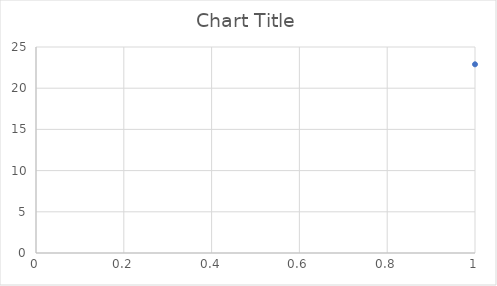
| Category | Series 0 |
|---|---|
| 0 | 22.9 |
| 1 | 22.9 |
| 2 | 22.9 |
| 3 | 22.9 |
| 4 | 22.9 |
| 5 | 22.9 |
| 6 | 22.9 |
| 7 | 22.9 |
| 8 | 22.9 |
| 9 | 22.8 |
| 10 | 22.9 |
| 11 | 22.8 |
| 12 | 22.8 |
| 13 | 22.8 |
| 14 | 22.8 |
| 15 | 22.8 |
| 16 | 22.8 |
| 17 | 22.8 |
| 18 | 22.8 |
| 19 | 22.8 |
| 20 | 22.8 |
| 21 | 22.8 |
| 22 | 22.8 |
| 23 | 22.8 |
| 24 | 22.8 |
| 25 | 22.8 |
| 26 | 22.8 |
| 27 | 22.8 |
| 28 | 22.8 |
| 29 | 22.8 |
| 30 | 22.8 |
| 31 | 22.8 |
| 32 | 22.8 |
| 33 | 22.8 |
| 34 | 22.8 |
| 35 | 22.8 |
| 36 | 22.8 |
| 37 | 22.7 |
| 38 | 22.8 |
| 39 | 22.7 |
| 40 | 22.7 |
| 41 | 22.7 |
| 42 | 22.8 |
| 43 | 22.7 |
| 44 | 22.7 |
| 45 | 22.7 |
| 46 | 22.7 |
| 47 | 22.7 |
| 48 | 22.7 |
| 49 | 22.8 |
| 50 | 22.7 |
| 51 | 22.7 |
| 52 | 22.7 |
| 53 | 22.7 |
| 54 | 22.7 |
| 55 | 22.7 |
| 56 | 22.7 |
| 57 | 22.7 |
| 58 | 22.7 |
| 59 | 22.7 |
| 60 | 22.7 |
| 61 | 22.7 |
| 62 | 22.7 |
| 63 | 22.7 |
| 64 | 22.7 |
| 65 | 22.7 |
| 66 | 22.7 |
| 67 | 22.7 |
| 68 | 22.7 |
| 69 | 22.7 |
| 70 | 22.7 |
| 71 | 22.7 |
| 72 | 22.7 |
| 73 | 22.7 |
| 74 | 22.7 |
| 75 | 22.7 |
| 76 | 22.7 |
| 77 | 22.7 |
| 78 | 22.7 |
| 79 | 22.7 |
| 80 | 22.7 |
| 81 | 22.7 |
| 82 | 22.7 |
| 83 | 22.7 |
| 84 | 22.7 |
| 85 | 22.7 |
| 86 | 22.7 |
| 87 | 22.7 |
| 88 | 22.7 |
| 89 | 22.7 |
| 90 | 22.7 |
| 91 | 22.7 |
| 92 | 22.7 |
| 93 | 22.7 |
| 94 | 22.7 |
| 95 | 22.6 |
| 96 | 22.6 |
| 97 | 22.7 |
| 98 | 22.7 |
| 99 | 22.6 |
| 100 | 22.7 |
| 101 | 22.7 |
| 102 | 22.6 |
| 103 | 22.7 |
| 104 | 22.6 |
| 105 | 22.7 |
| 106 | 22.6 |
| 107 | 21.5 |
| 108 | 17.3 |
| 109 | 17.4 |
| 110 | 17.7 |
| 111 | 17.9 |
| 112 | 18 |
| 113 | 18.1 |
| 114 | 18.2 |
| 115 | 18.3 |
| 116 | 18.3 |
| 117 | 18.6 |
| 118 | 18.7 |
| 119 | 18.7 |
| 120 | 18.7 |
| 121 | 18.4 |
| 122 | 18.4 |
| 123 | 18.7 |
| 124 | 18.4 |
| 125 | 18.5 |
| 126 | 18.7 |
| 127 | 18.7 |
| 128 | 18.4 |
| 129 | 18.6 |
| 130 | 18.7 |
| 131 | 18.5 |
| 132 | 18.5 |
| 133 | 18.8 |
| 134 | 18.7 |
| 135 | 18.5 |
| 136 | 18.7 |
| 137 | 18.8 |
| 138 | 18.6 |
| 139 | 18.8 |
| 140 | 18.8 |
| 141 | 18.9 |
| 142 | 18.7 |
| 143 | 18.9 |
| 144 | 18.7 |
| 145 | 18.9 |
| 146 | 18.9 |
| 147 | 20.5 |
| 148 | 22.6 |
| 149 | 22.6 |
| 150 | 22.6 |
| 151 | 22.6 |
| 152 | 22.6 |
| 153 | 22.5 |
| 154 | 22.5 |
| 155 | 22.5 |
| 156 | 22.5 |
| 157 | 22.5 |
| 158 | 22.5 |
| 159 | 22.4 |
| 160 | 22.4 |
| 161 | 22.3 |
| 162 | 22.3 |
| 163 | 22.3 |
| 164 | 22.2 |
| 165 | 22.2 |
| 166 | 22.1 |
| 167 | 22.1 |
| 168 | 22.1 |
| 169 | 22 |
| 170 | 22 |
| 171 | 21.9 |
| 172 | 21.9 |
| 173 | 21.8 |
| 174 | 21.8 |
| 175 | 21.7 |
| 176 | 21.6 |
| 177 | 21.6 |
| 178 | 21.6 |
| 179 | 21.5 |
| 180 | 21.5 |
| 181 | 21.4 |
| 182 | 21.4 |
| 183 | 21.3 |
| 184 | 21.3 |
| 185 | 21.2 |
| 186 | 21.1 |
| 187 | 21.1 |
| 188 | 21 |
| 189 | 21 |
| 190 | 20.9 |
| 191 | 20.8 |
| 192 | 20.8 |
| 193 | 20.7 |
| 194 | 20.6 |
| 195 | 20.5 |
| 196 | 20.5 |
| 197 | 20.4 |
| 198 | 20.3 |
| 199 | 20.2 |
| 200 | 20.1 |
| 201 | 20 |
| 202 | 19.9 |
| 203 | 19.8 |
| 204 | 19.7 |
| 205 | 19.7 |
| 206 | 19.6 |
| 207 | 19.5 |
| 208 | 19.4 |
| 209 | 19.3 |
| 210 | 19.3 |
| 211 | 19.2 |
| 212 | 19.1 |
| 213 | 19.4 |
| 214 | 19.8 |
| 215 | 19.9 |
| 216 | 20 |
| 217 | 20.4 |
| 218 | 21.2 |
| 219 | 21.8 |
| 220 | 22 |
| 221 | 17.8 |
| 222 | 17.7 |
| 223 | 17.8 |
| 224 | 17.9 |
| 225 | 18 |
| 226 | 18.1 |
| 227 | 18.1 |
| 228 | 21.9 |
| 229 | 20.9 |
| 230 | 18.2 |
| 231 | 18.2 |
| 232 | 18.2 |
| 233 | 18.3 |
| 234 | 18.3 |
| 235 | 18.3 |
| 236 | 18.5 |
| 237 | 18.7 |
| 238 | 18.7 |
| 239 | 18.8 |
| 240 | 18.8 |
| 241 | 18.5 |
| 242 | 18.8 |
| 243 | 19.5 |
| 244 | 22.6 |
| 245 | 22.6 |
| 246 | 22.6 |
| 247 | 22.5 |
| 248 | 22.5 |
| 249 | 22.5 |
| 250 | 22.5 |
| 251 | 22.5 |
| 252 | 22.4 |
| 253 | 22.4 |
| 254 | 22.4 |
| 255 | 22.4 |
| 256 | 22.3 |
| 257 | 22.3 |
| 258 | 22.2 |
| 259 | 22.2 |
| 260 | 22.2 |
| 261 | 22.1 |
| 262 | 22.1 |
| 263 | 22.1 |
| 264 | 22 |
| 265 | 22 |
| 266 | 21.9 |
| 267 | 21.9 |
| 268 | 21.8 |
| 269 | 21.8 |
| 270 | 21.7 |
| 271 | 21.7 |
| 272 | 21.6 |
| 273 | 21.6 |
| 274 | 21.5 |
| 275 | 21.5 |
| 276 | 21.4 |
| 277 | 21.3 |
| 278 | 21.3 |
| 279 | 21.2 |
| 280 | 21.2 |
| 281 | 21.1 |
| 282 | 21.1 |
| 283 | 21 |
| 284 | 20.9 |
| 285 | 20.9 |
| 286 | 20.8 |
| 287 | 20.7 |
| 288 | 20.7 |
| 289 | 20.6 |
| 290 | 20.6 |
| 291 | 20.5 |
| 292 | 20.5 |
| 293 | 20.4 |
| 294 | 20.3 |
| 295 | 20.3 |
| 296 | 20.2 |
| 297 | 20.2 |
| 298 | 20.1 |
| 299 | 20.1 |
| 300 | 20 |
| 301 | 19.9 |
| 302 | 19.9 |
| 303 | 19.8 |
| 304 | 19.8 |
| 305 | 19.7 |
| 306 | 19.7 |
| 307 | 19.6 |
| 308 | 19.6 |
| 309 | 19.5 |
| 310 | 19.5 |
| 311 | 19.4 |
| 312 | 19.3 |
| 313 | 19.2 |
| 314 | 19.2 |
| 315 | 19.3 |
| 316 | 19.2 |
| 317 | 19.1 |
| 318 | 17.6 |
| 319 | 17.7 |
| 320 | 17.9 |
| 321 | 18 |
| 322 | 18.1 |
| 323 | 18.1 |
| 324 | 18.2 |
| 325 | 18.2 |
| 326 | 18.3 |
| 327 | 18.3 |
| 328 | 18.3 |
| 329 | 18.5 |
| 330 | 18.4 |
| 331 | 18.6 |
| 332 | 18.6 |
| 333 | 18.5 |
| 334 | 18.5 |
| 335 | 18.7 |
| 336 | 18.4 |
| 337 | 18.7 |
| 338 | 18.6 |
| 339 | 19.7 |
| 340 | 22.6 |
| 341 | 22.6 |
| 342 | 22.5 |
| 343 | 22.5 |
| 344 | 22.5 |
| 345 | 22.4 |
| 346 | 22.4 |
| 347 | 22.3 |
| 348 | 22.3 |
| 349 | 22.3 |
| 350 | 22.2 |
| 351 | 22.2 |
| 352 | 22.1 |
| 353 | 22.1 |
| 354 | 22 |
| 355 | 22 |
| 356 | 21.9 |
| 357 | 21.9 |
| 358 | 21.8 |
| 359 | 21.8 |
| 360 | 21.7 |
| 361 | 21.6 |
| 362 | 21.6 |
| 363 | 21.5 |
| 364 | 21.5 |
| 365 | 21.4 |
| 366 | 21.4 |
| 367 | 21.3 |
| 368 | 21.2 |
| 369 | 21.2 |
| 370 | 21.1 |
| 371 | 21.1 |
| 372 | 21 |
| 373 | 20.9 |
| 374 | 20.9 |
| 375 | 20.8 |
| 376 | 20.7 |
| 377 | 20.7 |
| 378 | 20.6 |
| 379 | 20.5 |
| 380 | 20.5 |
| 381 | 20.4 |
| 382 | 20.3 |
| 383 | 20.3 |
| 384 | 20.2 |
| 385 | 20.2 |
| 386 | 20.1 |
| 387 | 20.1 |
| 388 | 20 |
| 389 | 19.9 |
| 390 | 19.9 |
| 391 | 19.8 |
| 392 | 19.7 |
| 393 | 19.7 |
| 394 | 19.6 |
| 395 | 19.6 |
| 396 | 19.5 |
| 397 | 19.4 |
| 398 | 19.4 |
| 399 | 19.3 |
| 400 | 19.2 |
| 401 | 19.2 |
| 402 | 19.1 |
| 403 | 19.1 |
| 404 | 19 |
| 405 | 18.9 |
| 406 | 18.9 |
| 407 | 18.8 |
| 408 | 18.8 |
| 409 | 18.7 |
| 410 | 18.6 |
| 411 | 18.5 |
| 412 | 19.2 |
| 413 | 22.9 |
| 414 | 0 |
| 415 | 0 |
| 416 | 0 |
| 417 | 0 |
| 418 | 0 |
| 419 | 0 |
| 420 | 0 |
| 421 | 0 |
| 422 | 0 |
| 423 | 0 |
| 424 | 0 |
| 425 | 0 |
| 426 | 0 |
| 427 | 0 |
| 428 | 0 |
| 429 | 0 |
| 430 | 0 |
| 431 | 0 |
| 432 | 0 |
| 433 | 0 |
| 434 | 0 |
| 435 | 0 |
| 436 | 0 |
| 437 | 0 |
| 438 | 0 |
| 439 | 0 |
| 440 | 0 |
| 441 | 0 |
| 442 | 0 |
| 443 | 0 |
| 444 | 0 |
| 445 | 0 |
| 446 | 0 |
| 447 | 0 |
| 448 | 0 |
| 449 | 0 |
| 450 | 0 |
| 451 | 0 |
| 452 | 0 |
| 453 | 0 |
| 454 | 0 |
| 455 | 0 |
| 456 | 0 |
| 457 | 0 |
| 458 | 0 |
| 459 | 0 |
| 460 | 0 |
| 461 | 0 |
| 462 | 0 |
| 463 | 0 |
| 464 | 0 |
| 465 | 0 |
| 466 | 0 |
| 467 | 0 |
| 468 | 0 |
| 469 | 0 |
| 470 | 0 |
| 471 | 0 |
| 472 | 0 |
| 473 | 0 |
| 474 | 0 |
| 475 | 0 |
| 476 | 0 |
| 477 | 0 |
| 478 | 0 |
| 479 | 0 |
| 480 | 0 |
| 481 | 0 |
| 482 | 0 |
| 483 | 0 |
| 484 | 0 |
| 485 | 0 |
| 486 | 0 |
| 487 | 0 |
| 488 | 0 |
| 489 | 0 |
| 490 | 0 |
| 491 | 0 |
| 492 | 0 |
| 493 | 0 |
| 494 | 0 |
| 495 | 0 |
| 496 | 0 |
| 497 | 0 |
| 498 | 0 |
| 499 | 0 |
| 500 | 0 |
| 501 | 0 |
| 502 | 0 |
| 503 | 0 |
| 504 | 0 |
| 505 | 0 |
| 506 | 0 |
| 507 | 0 |
| 508 | 0 |
| 509 | 0 |
| 510 | 0 |
| 511 | 0 |
| 512 | 0 |
| 513 | 0 |
| 514 | 0 |
| 515 | 0 |
| 516 | 0 |
| 517 | 0 |
| 518 | 0 |
| 519 | 0 |
| 520 | 0 |
| 521 | 0 |
| 522 | 0 |
| 523 | 0 |
| 524 | 0 |
| 525 | 0 |
| 526 | 0 |
| 527 | 0 |
| 528 | 0 |
| 529 | 0 |
| 530 | 0 |
| 531 | 0 |
| 532 | 0 |
| 533 | 0 |
| 534 | 0 |
| 535 | 0 |
| 536 | 0 |
| 537 | 0 |
| 538 | 0 |
| 539 | 0 |
| 540 | 0 |
| 541 | 0 |
| 542 | 0 |
| 543 | 0 |
| 544 | 0 |
| 545 | 0 |
| 546 | 0 |
| 547 | 0 |
| 548 | 0 |
| 549 | 0 |
| 550 | 0 |
| 551 | 0 |
| 552 | 0 |
| 553 | 0 |
| 554 | 0 |
| 555 | 0 |
| 556 | 0 |
| 557 | 0 |
| 558 | 0 |
| 559 | 0 |
| 560 | 0 |
| 561 | 0 |
| 562 | 0 |
| 563 | 0 |
| 564 | 0 |
| 565 | 0 |
| 566 | 0 |
| 567 | 0 |
| 568 | 0 |
| 569 | 0 |
| 570 | 0 |
| 571 | 0 |
| 572 | 0 |
| 573 | 0 |
| 574 | 0 |
| 575 | 0 |
| 576 | 0 |
| 577 | 0 |
| 578 | 0 |
| 579 | 0 |
| 580 | 0 |
| 581 | 0 |
| 582 | 0 |
| 583 | 0 |
| 584 | 0 |
| 585 | 0 |
| 586 | 0 |
| 587 | 0 |
| 588 | 0 |
| 589 | 0 |
| 590 | 0 |
| 591 | 0 |
| 592 | 0 |
| 593 | 0 |
| 594 | 0 |
| 595 | 0 |
| 596 | 0 |
| 597 | 0 |
| 598 | 0 |
| 599 | 0 |
| 600 | 0 |
| 601 | 0 |
| 602 | 0 |
| 603 | 0 |
| 604 | 0 |
| 605 | 0 |
| 606 | 0 |
| 607 | 0 |
| 608 | 0 |
| 609 | 0 |
| 610 | 0 |
| 611 | 0 |
| 612 | 0 |
| 613 | 0 |
| 614 | 0 |
| 615 | 0 |
| 616 | 0 |
| 617 | 0 |
| 618 | 0 |
| 619 | 0 |
| 620 | 0 |
| 621 | 0 |
| 622 | 0 |
| 623 | 0 |
| 624 | 0 |
| 625 | 0 |
| 626 | 0 |
| 627 | 0 |
| 628 | 0 |
| 629 | 0 |
| 630 | 0 |
| 631 | 0 |
| 632 | 0 |
| 633 | 0 |
| 634 | 0 |
| 635 | 0 |
| 636 | 0 |
| 637 | 0 |
| 638 | 0 |
| 639 | 0 |
| 640 | 0 |
| 641 | 0 |
| 642 | 0 |
| 643 | 0 |
| 644 | 0 |
| 645 | 0 |
| 646 | 0 |
| 647 | 0 |
| 648 | 0 |
| 649 | 0 |
| 650 | 0 |
| 651 | 0 |
| 652 | 0 |
| 653 | 0 |
| 654 | 0 |
| 655 | 0 |
| 656 | 0 |
| 657 | 0 |
| 658 | 0 |
| 659 | 0 |
| 660 | 0 |
| 661 | 0 |
| 662 | 0 |
| 663 | 0 |
| 664 | 0 |
| 665 | 0 |
| 666 | 0 |
| 667 | 0 |
| 668 | 0 |
| 669 | 0 |
| 670 | 0 |
| 671 | 0 |
| 672 | 0 |
| 673 | 0 |
| 674 | 0 |
| 675 | 0 |
| 676 | 0 |
| 677 | 0 |
| 678 | 0 |
| 679 | 0 |
| 680 | 0 |
| 681 | 0 |
| 682 | 0 |
| 683 | 0 |
| 684 | 0 |
| 685 | 0 |
| 686 | 0 |
| 687 | 0 |
| 688 | 0 |
| 689 | 0 |
| 690 | 0 |
| 691 | 0 |
| 692 | 0 |
| 693 | 0 |
| 694 | 0 |
| 695 | 0 |
| 696 | 0 |
| 697 | 0 |
| 698 | 0 |
| 699 | 0 |
| 700 | 0 |
| 701 | 0 |
| 702 | 0 |
| 703 | 0 |
| 704 | 0 |
| 705 | 0 |
| 706 | 0 |
| 707 | 0 |
| 708 | 0 |
| 709 | 0 |
| 710 | 0 |
| 711 | 0 |
| 712 | 0 |
| 713 | 0 |
| 714 | 0 |
| 715 | 0 |
| 716 | 0 |
| 717 | 0 |
| 718 | 0 |
| 719 | 0 |
| 720 | 0 |
| 721 | 0 |
| 722 | 0 |
| 723 | 0 |
| 724 | 0 |
| 725 | 0 |
| 726 | 0 |
| 727 | 0 |
| 728 | 0 |
| 729 | 0 |
| 730 | 0 |
| 731 | 0 |
| 732 | 0 |
| 733 | 0 |
| 734 | 0 |
| 735 | 0 |
| 736 | 0 |
| 737 | 0 |
| 738 | 0 |
| 739 | 0 |
| 740 | 0 |
| 741 | 0 |
| 742 | 0 |
| 743 | 0 |
| 744 | 0 |
| 745 | 0 |
| 746 | 0 |
| 747 | 0 |
| 748 | 0 |
| 749 | 0 |
| 750 | 0 |
| 751 | 0 |
| 752 | 0 |
| 753 | 0 |
| 754 | 0 |
| 755 | 0 |
| 756 | 0 |
| 757 | 0 |
| 758 | 0 |
| 759 | 0 |
| 760 | 0 |
| 761 | 0 |
| 762 | 0 |
| 763 | 0 |
| 764 | 0 |
| 765 | 0 |
| 766 | 0 |
| 767 | 0 |
| 768 | 0 |
| 769 | 0 |
| 770 | 0 |
| 771 | 0 |
| 772 | 0 |
| 773 | 0 |
| 774 | 0 |
| 775 | 0 |
| 776 | 0 |
| 777 | 0 |
| 778 | 0 |
| 779 | 0 |
| 780 | 0 |
| 781 | 0 |
| 782 | 0 |
| 783 | 0 |
| 784 | 0 |
| 785 | 0 |
| 786 | 0 |
| 787 | 0 |
| 788 | 0 |
| 789 | 0 |
| 790 | 0 |
| 791 | 0 |
| 792 | 0 |
| 793 | 0 |
| 794 | 0 |
| 795 | 0 |
| 796 | 0 |
| 797 | 0 |
| 798 | 0 |
| 799 | 0 |
| 800 | 0 |
| 801 | 0 |
| 802 | 0 |
| 803 | 0 |
| 804 | 0 |
| 805 | 0 |
| 806 | 0 |
| 807 | 0 |
| 808 | 0 |
| 809 | 0 |
| 810 | 0 |
| 811 | 0 |
| 812 | 0 |
| 813 | 0 |
| 814 | 0 |
| 815 | 0 |
| 816 | 0 |
| 817 | 0 |
| 818 | 0 |
| 819 | 0 |
| 820 | 0 |
| 821 | 0 |
| 822 | 0 |
| 823 | 0 |
| 824 | 0 |
| 825 | 0 |
| 826 | 0 |
| 827 | 0 |
| 828 | 0 |
| 829 | 0 |
| 830 | 0 |
| 831 | 0 |
| 832 | 0 |
| 833 | 0 |
| 834 | 0 |
| 835 | 0 |
| 836 | 0 |
| 837 | 0 |
| 838 | 0 |
| 839 | 0 |
| 840 | 0 |
| 841 | 0 |
| 842 | 0 |
| 843 | 0 |
| 844 | 0 |
| 845 | 0 |
| 846 | 0 |
| 847 | 0 |
| 848 | 0 |
| 849 | 0 |
| 850 | 0 |
| 851 | 0 |
| 852 | 0 |
| 853 | 0 |
| 854 | 0 |
| 855 | 0 |
| 856 | 0 |
| 857 | 0 |
| 858 | 0 |
| 859 | 0 |
| 860 | 0 |
| 861 | 0 |
| 862 | 0 |
| 863 | 0 |
| 864 | 0 |
| 865 | 0 |
| 866 | 0 |
| 867 | 0 |
| 868 | 0 |
| 869 | 0 |
| 870 | 0 |
| 871 | 0 |
| 872 | 0 |
| 873 | 0 |
| 874 | 0 |
| 875 | 0 |
| 876 | 0 |
| 877 | 0 |
| 878 | 0 |
| 879 | 0 |
| 880 | 0 |
| 881 | 0 |
| 882 | 0 |
| 883 | 0 |
| 884 | 0 |
| 885 | 0 |
| 886 | 0 |
| 887 | 0 |
| 888 | 0 |
| 889 | 0 |
| 890 | 0 |
| 891 | 0 |
| 892 | 0 |
| 893 | 0 |
| 894 | 0 |
| 895 | 0 |
| 896 | 0 |
| 897 | 0 |
| 898 | 0 |
| 899 | 0 |
| 900 | 0 |
| 901 | 0 |
| 902 | 0 |
| 903 | 0 |
| 904 | 0 |
| 905 | 0 |
| 906 | 0 |
| 907 | 0 |
| 908 | 0 |
| 909 | 0 |
| 910 | 0 |
| 911 | 0 |
| 912 | 0 |
| 913 | 0 |
| 914 | 0 |
| 915 | 0 |
| 916 | 0 |
| 917 | 0 |
| 918 | 0 |
| 919 | 0 |
| 920 | 0 |
| 921 | 0 |
| 922 | 0 |
| 923 | 0 |
| 924 | 0 |
| 925 | 0 |
| 926 | 0 |
| 927 | 0 |
| 928 | 0 |
| 929 | 0 |
| 930 | 0 |
| 931 | 0 |
| 932 | 0 |
| 933 | 0 |
| 934 | 0 |
| 935 | 0 |
| 936 | 0 |
| 937 | 0 |
| 938 | 0 |
| 939 | 0 |
| 940 | 0 |
| 941 | 0 |
| 942 | 0 |
| 943 | 0 |
| 944 | 0 |
| 945 | 0 |
| 946 | 0 |
| 947 | 0 |
| 948 | 0 |
| 949 | 0 |
| 950 | 0 |
| 951 | 0 |
| 952 | 0 |
| 953 | 0 |
| 954 | 0 |
| 955 | 0 |
| 956 | 0 |
| 957 | 0 |
| 958 | 0 |
| 959 | 0 |
| 960 | 0 |
| 961 | 0 |
| 962 | 0 |
| 963 | 0 |
| 964 | 0 |
| 965 | 0 |
| 966 | 0 |
| 967 | 0 |
| 968 | 0 |
| 969 | 0 |
| 970 | 0 |
| 971 | 0 |
| 972 | 0 |
| 973 | 0 |
| 974 | 0 |
| 975 | 0 |
| 976 | 0 |
| 977 | 0 |
| 978 | 0 |
| 979 | 0 |
| 980 | 0 |
| 981 | 0 |
| 982 | 0 |
| 983 | 0 |
| 984 | 0 |
| 985 | 0 |
| 986 | 0 |
| 987 | 0 |
| 988 | 0 |
| 989 | 0 |
| 990 | 0 |
| 991 | 0 |
| 992 | 0 |
| 993 | 0 |
| 994 | 0 |
| 995 | 0 |
| 996 | 0 |
| 997 | 0 |
| 998 | 0 |
| 999 | 0 |
| 1000 | 0 |
| 1001 | 0 |
| 1002 | 0 |
| 1003 | 0 |
| 1004 | 0 |
| 1005 | 0 |
| 1006 | 0 |
| 1007 | 0 |
| 1008 | 0 |
| 1009 | 0 |
| 1010 | 0 |
| 1011 | 0 |
| 1012 | 0 |
| 1013 | 0 |
| 1014 | 0 |
| 1015 | 0 |
| 1016 | 0 |
| 1017 | 0 |
| 1018 | 0 |
| 1019 | 0 |
| 1020 | 0 |
| 1021 | 0 |
| 1022 | 0 |
| 1023 | 0 |
| 1024 | 0 |
| 1025 | 0 |
| 1026 | 0 |
| 1027 | 0 |
| 1028 | 0 |
| 1029 | 0 |
| 1030 | 0 |
| 1031 | 0 |
| 1032 | 0 |
| 1033 | 0 |
| 1034 | 0 |
| 1035 | 0 |
| 1036 | 0 |
| 1037 | 0 |
| 1038 | 0 |
| 1039 | 0 |
| 1040 | 0 |
| 1041 | 0 |
| 1042 | 0 |
| 1043 | 0 |
| 1044 | 0 |
| 1045 | 0 |
| 1046 | 0 |
| 1047 | 0 |
| 1048 | 0 |
| 1049 | 0 |
| 1050 | 0 |
| 1051 | 0 |
| 1052 | 0 |
| 1053 | 0 |
| 1054 | 0 |
| 1055 | 0 |
| 1056 | 0 |
| 1057 | 0 |
| 1058 | 0 |
| 1059 | 0 |
| 1060 | 0 |
| 1061 | 0 |
| 1062 | 0 |
| 1063 | 0 |
| 1064 | 0 |
| 1065 | 0 |
| 1066 | 0 |
| 1067 | 0 |
| 1068 | 0 |
| 1069 | 0 |
| 1070 | 0 |
| 1071 | 0 |
| 1072 | 0 |
| 1073 | 0 |
| 1074 | 0 |
| 1075 | 0 |
| 1076 | 0 |
| 1077 | 0 |
| 1078 | 0 |
| 1079 | 0 |
| 1080 | 0 |
| 1081 | 0 |
| 1082 | 0 |
| 1083 | 0 |
| 1084 | 0 |
| 1085 | 0 |
| 1086 | 0 |
| 1087 | 0 |
| 1088 | 0 |
| 1089 | 0 |
| 1090 | 0 |
| 1091 | 0 |
| 1092 | 0 |
| 1093 | 0 |
| 1094 | 0 |
| 1095 | 0 |
| 1096 | 0 |
| 1097 | 0 |
| 1098 | 0 |
| 1099 | 0 |
| 1100 | 0 |
| 1101 | 0 |
| 1102 | 0 |
| 1103 | 0 |
| 1104 | 0 |
| 1105 | 0 |
| 1106 | 0 |
| 1107 | 0 |
| 1108 | 0 |
| 1109 | 0 |
| 1110 | 0 |
| 1111 | 0 |
| 1112 | 0 |
| 1113 | 0 |
| 1114 | 0 |
| 1115 | 0 |
| 1116 | 0 |
| 1117 | 0 |
| 1118 | 0 |
| 1119 | 0 |
| 1120 | 0 |
| 1121 | 0 |
| 1122 | 0 |
| 1123 | 0 |
| 1124 | 0 |
| 1125 | 0 |
| 1126 | 0 |
| 1127 | 0 |
| 1128 | 0 |
| 1129 | 0 |
| 1130 | 0 |
| 1131 | 0 |
| 1132 | 0 |
| 1133 | 0 |
| 1134 | 0 |
| 1135 | 0 |
| 1136 | 0 |
| 1137 | 0 |
| 1138 | 0 |
| 1139 | 0 |
| 1140 | 0 |
| 1141 | 0 |
| 1142 | 0 |
| 1143 | 0 |
| 1144 | 0 |
| 1145 | 0 |
| 1146 | 0 |
| 1147 | 0 |
| 1148 | 0 |
| 1149 | 0 |
| 1150 | 0 |
| 1151 | 0 |
| 1152 | 0 |
| 1153 | 0 |
| 1154 | 0 |
| 1155 | 0 |
| 1156 | 0 |
| 1157 | 0 |
| 1158 | 0 |
| 1159 | 0 |
| 1160 | 0 |
| 1161 | 0 |
| 1162 | 0 |
| 1163 | 0 |
| 1164 | 0 |
| 1165 | 0 |
| 1166 | 0 |
| 1167 | 0 |
| 1168 | 0 |
| 1169 | 0 |
| 1170 | 0 |
| 1171 | 0 |
| 1172 | 0 |
| 1173 | 0 |
| 1174 | 0 |
| 1175 | 0 |
| 1176 | 0 |
| 1177 | 0 |
| 1178 | 0 |
| 1179 | 0 |
| 1180 | 0 |
| 1181 | 0 |
| 1182 | 0 |
| 1183 | 0 |
| 1184 | 0 |
| 1185 | 0 |
| 1186 | 0 |
| 1187 | 0 |
| 1188 | 0 |
| 1189 | 0 |
| 1190 | 0 |
| 1191 | 0 |
| 1192 | 0 |
| 1193 | 0 |
| 1194 | 0 |
| 1195 | 0 |
| 1196 | 0 |
| 1197 | 0 |
| 1198 | 0 |
| 1199 | 0 |
| 1200 | 0 |
| 1201 | 0 |
| 1202 | 0 |
| 1203 | 0 |
| 1204 | 0 |
| 1205 | 0 |
| 1206 | 0 |
| 1207 | 0 |
| 1208 | 0 |
| 1209 | 0 |
| 1210 | 0 |
| 1211 | 0 |
| 1212 | 0 |
| 1213 | 0 |
| 1214 | 0 |
| 1215 | 0 |
| 1216 | 0 |
| 1217 | 0 |
| 1218 | 0 |
| 1219 | 0 |
| 1220 | 0 |
| 1221 | 0 |
| 1222 | 0 |
| 1223 | 0 |
| 1224 | 0 |
| 1225 | 0 |
| 1226 | 0 |
| 1227 | 0 |
| 1228 | 0 |
| 1229 | 0 |
| 1230 | 0 |
| 1231 | 0 |
| 1232 | 0 |
| 1233 | 0 |
| 1234 | 0 |
| 1235 | 0 |
| 1236 | 0 |
| 1237 | 0 |
| 1238 | 0 |
| 1239 | 0 |
| 1240 | 0 |
| 1241 | 0 |
| 1242 | 0 |
| 1243 | 0 |
| 1244 | 0 |
| 1245 | 0 |
| 1246 | 0 |
| 1247 | 0 |
| 1248 | 0 |
| 1249 | 0 |
| 1250 | 0 |
| 1251 | 0 |
| 1252 | 0 |
| 1253 | 0 |
| 1254 | 0 |
| 1255 | 0 |
| 1256 | 0 |
| 1257 | 0 |
| 1258 | 0 |
| 1259 | 0 |
| 1260 | 0 |
| 1261 | 0 |
| 1262 | 0 |
| 1263 | 0 |
| 1264 | 0 |
| 1265 | 0 |
| 1266 | 0 |
| 1267 | 0 |
| 1268 | 0 |
| 1269 | 0 |
| 1270 | 0 |
| 1271 | 0 |
| 1272 | 0 |
| 1273 | 0 |
| 1274 | 0 |
| 1275 | 0 |
| 1276 | 0 |
| 1277 | 0 |
| 1278 | 0 |
| 1279 | 0 |
| 1280 | 0 |
| 1281 | 0 |
| 1282 | 0 |
| 1283 | 0 |
| 1284 | 0 |
| 1285 | 0 |
| 1286 | 0 |
| 1287 | 0 |
| 1288 | 0 |
| 1289 | 0 |
| 1290 | 0 |
| 1291 | 0 |
| 1292 | 0 |
| 1293 | 0 |
| 1294 | 0 |
| 1295 | 0 |
| 1296 | 0 |
| 1297 | 0 |
| 1298 | 0 |
| 1299 | 0 |
| 1300 | 0 |
| 1301 | 0 |
| 1302 | 0 |
| 1303 | 0 |
| 1304 | 0 |
| 1305 | 0 |
| 1306 | 0 |
| 1307 | 0 |
| 1308 | 0 |
| 1309 | 0 |
| 1310 | 0 |
| 1311 | 0 |
| 1312 | 0 |
| 1313 | 0 |
| 1314 | 0 |
| 1315 | 0 |
| 1316 | 0 |
| 1317 | 0 |
| 1318 | 0 |
| 1319 | 0 |
| 1320 | 0 |
| 1321 | 0 |
| 1322 | 0 |
| 1323 | 0 |
| 1324 | 0 |
| 1325 | 0 |
| 1326 | 0 |
| 1327 | 0 |
| 1328 | 0 |
| 1329 | 0 |
| 1330 | 0 |
| 1331 | 0 |
| 1332 | 0 |
| 1333 | 0 |
| 1334 | 0 |
| 1335 | 0 |
| 1336 | 0 |
| 1337 | 0 |
| 1338 | 0 |
| 1339 | 0 |
| 1340 | 0 |
| 1341 | 0 |
| 1342 | 0 |
| 1343 | 0 |
| 1344 | 0 |
| 1345 | 0 |
| 1346 | 0 |
| 1347 | 0 |
| 1348 | 0 |
| 1349 | 0 |
| 1350 | 0 |
| 1351 | 0 |
| 1352 | 0 |
| 1353 | 0 |
| 1354 | 0 |
| 1355 | 0 |
| 1356 | 0 |
| 1357 | 0 |
| 1358 | 0 |
| 1359 | 0 |
| 1360 | 0 |
| 1361 | 0 |
| 1362 | 0 |
| 1363 | 0 |
| 1364 | 0 |
| 1365 | 0 |
| 1366 | 0 |
| 1367 | 0 |
| 1368 | 0 |
| 1369 | 0 |
| 1370 | 0 |
| 1371 | 0 |
| 1372 | 0 |
| 1373 | 0 |
| 1374 | 0 |
| 1375 | 0 |
| 1376 | 0 |
| 1377 | 0 |
| 1378 | 0 |
| 1379 | 0 |
| 1380 | 0 |
| 1381 | 0 |
| 1382 | 0 |
| 1383 | 0 |
| 1384 | 0 |
| 1385 | 0 |
| 1386 | 0 |
| 1387 | 0 |
| 1388 | 0 |
| 1389 | 0 |
| 1390 | 0 |
| 1391 | 0 |
| 1392 | 0 |
| 1393 | 0 |
| 1394 | 0 |
| 1395 | 0 |
| 1396 | 0 |
| 1397 | 0 |
| 1398 | 0 |
| 1399 | 0 |
| 1400 | 0 |
| 1401 | 0 |
| 1402 | 0 |
| 1403 | 0 |
| 1404 | 0 |
| 1405 | 0 |
| 1406 | 0 |
| 1407 | 0 |
| 1408 | 0 |
| 1409 | 0 |
| 1410 | 0 |
| 1411 | 0 |
| 1412 | 0 |
| 1413 | 0 |
| 1414 | 0 |
| 1415 | 0 |
| 1416 | 0 |
| 1417 | 0 |
| 1418 | 0 |
| 1419 | 0 |
| 1420 | 0 |
| 1421 | 0 |
| 1422 | 0 |
| 1423 | 0 |
| 1424 | 0 |
| 1425 | 0 |
| 1426 | 0 |
| 1427 | 0 |
| 1428 | 0 |
| 1429 | 0 |
| 1430 | 0 |
| 1431 | 0 |
| 1432 | 0 |
| 1433 | 0 |
| 1434 | 0 |
| 1435 | 0 |
| 1436 | 0 |
| 1437 | 0 |
| 1438 | 0 |
| 1439 | 0 |
| 1440 | 0 |
| 1441 | 0 |
| 1442 | 0 |
| 1443 | 0 |
| 1444 | 0 |
| 1445 | 0 |
| 1446 | 0 |
| 1447 | 0 |
| 1448 | 0 |
| 1449 | 0 |
| 1450 | 0 |
| 1451 | 0 |
| 1452 | 0 |
| 1453 | 0 |
| 1454 | 0 |
| 1455 | 0 |
| 1456 | 0 |
| 1457 | 0 |
| 1458 | 0 |
| 1459 | 0 |
| 1460 | 0 |
| 1461 | 0 |
| 1462 | 0 |
| 1463 | 0 |
| 1464 | 0 |
| 1465 | 0 |
| 1466 | 0 |
| 1467 | 0 |
| 1468 | 0 |
| 1469 | 0 |
| 1470 | 0 |
| 1471 | 0 |
| 1472 | 0 |
| 1473 | 0 |
| 1474 | 0 |
| 1475 | 0 |
| 1476 | 0 |
| 1477 | 0 |
| 1478 | 0 |
| 1479 | 0 |
| 1480 | 0 |
| 1481 | 0 |
| 1482 | 0 |
| 1483 | 0 |
| 1484 | 0 |
| 1485 | 0 |
| 1486 | 0 |
| 1487 | 0 |
| 1488 | 0 |
| 1489 | 0 |
| 1490 | 0 |
| 1491 | 0 |
| 1492 | 0 |
| 1493 | 0 |
| 1494 | 0 |
| 1495 | 0 |
| 1496 | 0 |
| 1497 | 0 |
| 1498 | 0 |
| 1499 | 0 |
| 1500 | 0 |
| 1501 | 0 |
| 1502 | 0 |
| 1503 | 0 |
| 1504 | 0 |
| 1505 | 0 |
| 1506 | 0 |
| 1507 | 0 |
| 1508 | 0 |
| 1509 | 0 |
| 1510 | 0 |
| 1511 | 0 |
| 1512 | 0 |
| 1513 | 0 |
| 1514 | 0 |
| 1515 | 0 |
| 1516 | 0 |
| 1517 | 0 |
| 1518 | 0 |
| 1519 | 0 |
| 1520 | 0 |
| 1521 | 0 |
| 1522 | 0 |
| 1523 | 0 |
| 1524 | 0 |
| 1525 | 0 |
| 1526 | 0 |
| 1527 | 0 |
| 1528 | 0 |
| 1529 | 0 |
| 1530 | 0 |
| 1531 | 0 |
| 1532 | 0 |
| 1533 | 0 |
| 1534 | 0 |
| 1535 | 0 |
| 1536 | 0 |
| 1537 | 0 |
| 1538 | 0 |
| 1539 | 0 |
| 1540 | 0 |
| 1541 | 0 |
| 1542 | 0 |
| 1543 | 0 |
| 1544 | 0 |
| 1545 | 0 |
| 1546 | 0 |
| 1547 | 0 |
| 1548 | 0 |
| 1549 | 0 |
| 1550 | 0 |
| 1551 | 0 |
| 1552 | 0 |
| 1553 | 0 |
| 1554 | 0 |
| 1555 | 0 |
| 1556 | 0 |
| 1557 | 0 |
| 1558 | 0 |
| 1559 | 0 |
| 1560 | 0 |
| 1561 | 0 |
| 1562 | 0 |
| 1563 | 0 |
| 1564 | 0 |
| 1565 | 0 |
| 1566 | 0 |
| 1567 | 0 |
| 1568 | 0 |
| 1569 | 0 |
| 1570 | 0 |
| 1571 | 0 |
| 1572 | 0 |
| 1573 | 0 |
| 1574 | 0 |
| 1575 | 0 |
| 1576 | 0 |
| 1577 | 0 |
| 1578 | 0 |
| 1579 | 0 |
| 1580 | 0 |
| 1581 | 0 |
| 1582 | 0 |
| 1583 | 0 |
| 1584 | 0 |
| 1585 | 0 |
| 1586 | 0 |
| 1587 | 0 |
| 1588 | 0 |
| 1589 | 0 |
| 1590 | 0 |
| 1591 | 0 |
| 1592 | 0 |
| 1593 | 0 |
| 1594 | 0 |
| 1595 | 0 |
| 1596 | 0 |
| 1597 | 0 |
| 1598 | 0 |
| 1599 | 0 |
| 1600 | 0 |
| 1601 | 0 |
| 1602 | 0 |
| 1603 | 0 |
| 1604 | 0 |
| 1605 | 0 |
| 1606 | 0 |
| 1607 | 0 |
| 1608 | 0 |
| 1609 | 0 |
| 1610 | 0 |
| 1611 | 0 |
| 1612 | 0 |
| 1613 | 0 |
| 1614 | 0 |
| 1615 | 0 |
| 1616 | 0 |
| 1617 | 0 |
| 1618 | 0 |
| 1619 | 0 |
| 1620 | 0 |
| 1621 | 0 |
| 1622 | 0 |
| 1623 | 0 |
| 1624 | 0 |
| 1625 | 0 |
| 1626 | 0 |
| 1627 | 0 |
| 1628 | 0 |
| 1629 | 0 |
| 1630 | 0 |
| 1631 | 0 |
| 1632 | 0 |
| 1633 | 0 |
| 1634 | 0 |
| 1635 | 0 |
| 1636 | 0 |
| 1637 | 0 |
| 1638 | 0 |
| 1639 | 0 |
| 1640 | 0 |
| 1641 | 0 |
| 1642 | 0 |
| 1643 | 0 |
| 1644 | 0 |
| 1645 | 0 |
| 1646 | 0 |
| 1647 | 0 |
| 1648 | 0 |
| 1649 | 0 |
| 1650 | 0 |
| 1651 | 0 |
| 1652 | 0 |
| 1653 | 0 |
| 1654 | 0 |
| 1655 | 0 |
| 1656 | 0 |
| 1657 | 0 |
| 1658 | 0 |
| 1659 | 0 |
| 1660 | 0 |
| 1661 | 0 |
| 1662 | 0 |
| 1663 | 0 |
| 1664 | 0 |
| 1665 | 0 |
| 1666 | 0 |
| 1667 | 0 |
| 1668 | 0 |
| 1669 | 0 |
| 1670 | 0 |
| 1671 | 0 |
| 1672 | 0 |
| 1673 | 0 |
| 1674 | 0 |
| 1675 | 0 |
| 1676 | 0 |
| 1677 | 0 |
| 1678 | 0 |
| 1679 | 0 |
| 1680 | 0 |
| 1681 | 0 |
| 1682 | 0 |
| 1683 | 0 |
| 1684 | 0 |
| 1685 | 0 |
| 1686 | 0 |
| 1687 | 0 |
| 1688 | 0 |
| 1689 | 0 |
| 1690 | 0 |
| 1691 | 0 |
| 1692 | 0 |
| 1693 | 0 |
| 1694 | 0 |
| 1695 | 0 |
| 1696 | 0 |
| 1697 | 0 |
| 1698 | 0 |
| 1699 | 0 |
| 1700 | 0 |
| 1701 | 0 |
| 1702 | 0 |
| 1703 | 0 |
| 1704 | 0 |
| 1705 | 0 |
| 1706 | 0 |
| 1707 | 0 |
| 1708 | 0 |
| 1709 | 0 |
| 1710 | 0 |
| 1711 | 0 |
| 1712 | 0 |
| 1713 | 0 |
| 1714 | 0 |
| 1715 | 0 |
| 1716 | 0 |
| 1717 | 0 |
| 1718 | 0 |
| 1719 | 0 |
| 1720 | 0 |
| 1721 | 0 |
| 1722 | 0 |
| 1723 | 0 |
| 1724 | 0 |
| 1725 | 0 |
| 1726 | 0 |
| 1727 | 0 |
| 1728 | 0 |
| 1729 | 0 |
| 1730 | 0 |
| 1731 | 0 |
| 1732 | 0 |
| 1733 | 0 |
| 1734 | 0 |
| 1735 | 0 |
| 1736 | 0 |
| 1737 | 0 |
| 1738 | 0 |
| 1739 | 0 |
| 1740 | 0 |
| 1741 | 0 |
| 1742 | 0 |
| 1743 | 0 |
| 1744 | 0 |
| 1745 | 0 |
| 1746 | 0 |
| 1747 | 0 |
| 1748 | 0 |
| 1749 | 0 |
| 1750 | 0 |
| 1751 | 0 |
| 1752 | 0 |
| 1753 | 0 |
| 1754 | 0 |
| 1755 | 0 |
| 1756 | 0 |
| 1757 | 0 |
| 1758 | 0 |
| 1759 | 0 |
| 1760 | 0 |
| 1761 | 0 |
| 1762 | 0 |
| 1763 | 0 |
| 1764 | 0 |
| 1765 | 0 |
| 1766 | 0 |
| 1767 | 0 |
| 1768 | 0 |
| 1769 | 0 |
| 1770 | 0 |
| 1771 | 0 |
| 1772 | 0 |
| 1773 | 0 |
| 1774 | 0 |
| 1775 | 0 |
| 1776 | 0 |
| 1777 | 0 |
| 1778 | 0 |
| 1779 | 0 |
| 1780 | 0 |
| 1781 | 0 |
| 1782 | 0 |
| 1783 | 0 |
| 1784 | 0 |
| 1785 | 0 |
| 1786 | 0 |
| 1787 | 0 |
| 1788 | 0 |
| 1789 | 0 |
| 1790 | 0 |
| 1791 | 0 |
| 1792 | 0 |
| 1793 | 0 |
| 1794 | 0 |
| 1795 | 0 |
| 1796 | 0 |
| 1797 | 0 |
| 1798 | 0 |
| 1799 | 0 |
| 1800 | 0 |
| 1801 | 0 |
| 1802 | 0 |
| 1803 | 0 |
| 1804 | 0 |
| 1805 | 0 |
| 1806 | 0 |
| 1807 | 0 |
| 1808 | 0 |
| 1809 | 0 |
| 1810 | 0 |
| 1811 | 0 |
| 1812 | 0 |
| 1813 | 0 |
| 1814 | 0 |
| 1815 | 0 |
| 1816 | 0 |
| 1817 | 0 |
| 1818 | 0 |
| 1819 | 0 |
| 1820 | 0 |
| 1821 | 0 |
| 1822 | 0 |
| 1823 | 0 |
| 1824 | 0 |
| 1825 | 0 |
| 1826 | 0 |
| 1827 | 0 |
| 1828 | 0 |
| 1829 | 0 |
| 1830 | 0 |
| 1831 | 0 |
| 1832 | 0 |
| 1833 | 0 |
| 1834 | 0 |
| 1835 | 0 |
| 1836 | 0 |
| 1837 | 0 |
| 1838 | 0 |
| 1839 | 0 |
| 1840 | 0 |
| 1841 | 0 |
| 1842 | 0 |
| 1843 | 0 |
| 1844 | 0 |
| 1845 | 0 |
| 1846 | 0 |
| 1847 | 0 |
| 1848 | 0 |
| 1849 | 0 |
| 1850 | 0 |
| 1851 | 0 |
| 1852 | 0 |
| 1853 | 0 |
| 1854 | 0 |
| 1855 | 0 |
| 1856 | 0 |
| 1857 | 0 |
| 1858 | 0 |
| 1859 | 0 |
| 1860 | 0 |
| 1861 | 0 |
| 1862 | 0 |
| 1863 | 0 |
| 1864 | 0 |
| 1865 | 0 |
| 1866 | 0 |
| 1867 | 0 |
| 1868 | 0 |
| 1869 | 0 |
| 1870 | 0 |
| 1871 | 0 |
| 1872 | 0 |
| 1873 | 0 |
| 1874 | 0 |
| 1875 | 0 |
| 1876 | 0 |
| 1877 | 0 |
| 1878 | 0 |
| 1879 | 0 |
| 1880 | 0 |
| 1881 | 0 |
| 1882 | 0 |
| 1883 | 0 |
| 1884 | 0 |
| 1885 | 0 |
| 1886 | 0 |
| 1887 | 0 |
| 1888 | 0 |
| 1889 | 0 |
| 1890 | 0 |
| 1891 | 0 |
| 1892 | 0 |
| 1893 | 0 |
| 1894 | 0 |
| 1895 | 0 |
| 1896 | 0 |
| 1897 | 0 |
| 1898 | 0 |
| 1899 | 0 |
| 1900 | 0 |
| 1901 | 0 |
| 1902 | 0 |
| 1903 | 0 |
| 1904 | 0 |
| 1905 | 0 |
| 1906 | 0 |
| 1907 | 0 |
| 1908 | 0 |
| 1909 | 0 |
| 1910 | 0 |
| 1911 | 0 |
| 1912 | 0 |
| 1913 | 0 |
| 1914 | 0 |
| 1915 | 0 |
| 1916 | 0 |
| 1917 | 0 |
| 1918 | 0 |
| 1919 | 0 |
| 1920 | 0 |
| 1921 | 0 |
| 1922 | 0 |
| 1923 | 0 |
| 1924 | 0 |
| 1925 | 0 |
| 1926 | 0 |
| 1927 | 0 |
| 1928 | 0 |
| 1929 | 0 |
| 1930 | 0 |
| 1931 | 0 |
| 1932 | 0 |
| 1933 | 0 |
| 1934 | 0 |
| 1935 | 0 |
| 1936 | 0 |
| 1937 | 0 |
| 1938 | 0 |
| 1939 | 0 |
| 1940 | 0 |
| 1941 | 0 |
| 1942 | 0 |
| 1943 | 0 |
| 1944 | 0 |
| 1945 | 0 |
| 1946 | 0 |
| 1947 | 0 |
| 1948 | 0 |
| 1949 | 0 |
| 1950 | 0 |
| 1951 | 0 |
| 1952 | 0 |
| 1953 | 0 |
| 1954 | 0 |
| 1955 | 0 |
| 1956 | 0 |
| 1957 | 0 |
| 1958 | 0 |
| 1959 | 0 |
| 1960 | 0 |
| 1961 | 0 |
| 1962 | 0 |
| 1963 | 0 |
| 1964 | 0 |
| 1965 | 0 |
| 1966 | 0 |
| 1967 | 0 |
| 1968 | 0 |
| 1969 | 0 |
| 1970 | 0 |
| 1971 | 0 |
| 1972 | 0 |
| 1973 | 0 |
| 1974 | 0 |